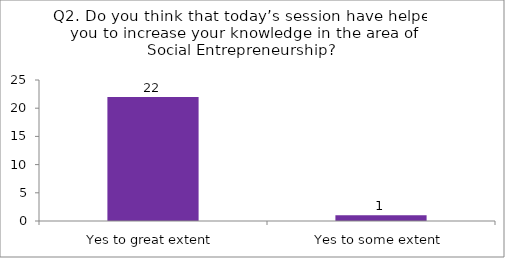
| Category | Q2. Do you think that today’s session have helped you to increase your knowledge in the area of Social Entrepreneurship? |
|---|---|
| Yes to great extent | 22 |
| Yes to some extent | 1 |